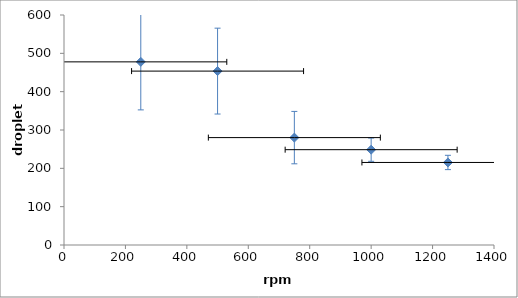
| Category | Hexane/ 1 % Tween 20 |
|---|---|
| 250.0 | 477.75 |
| 500.0 | 453.667 |
| 750.0 | 280.167 |
| 1000.0 | 248.667 |
| 1250.0 | 215.333 |